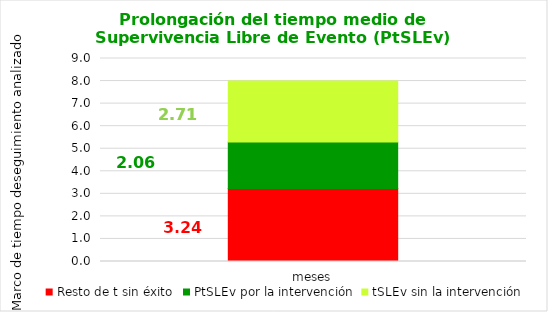
| Category | Resto de t sin éxito | PtSLEv por la intervención | tSLEv sin la intervención |
|---|---|---|---|
| meses | 3.235 | 2.059 | 2.706 |